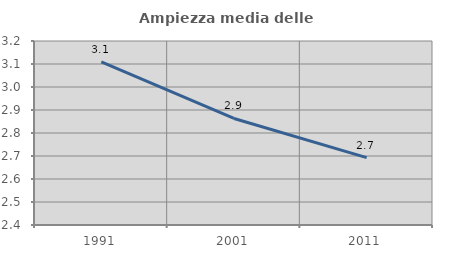
| Category | Ampiezza media delle famiglie |
|---|---|
| 1991.0 | 3.109 |
| 2001.0 | 2.863 |
| 2011.0 | 2.693 |